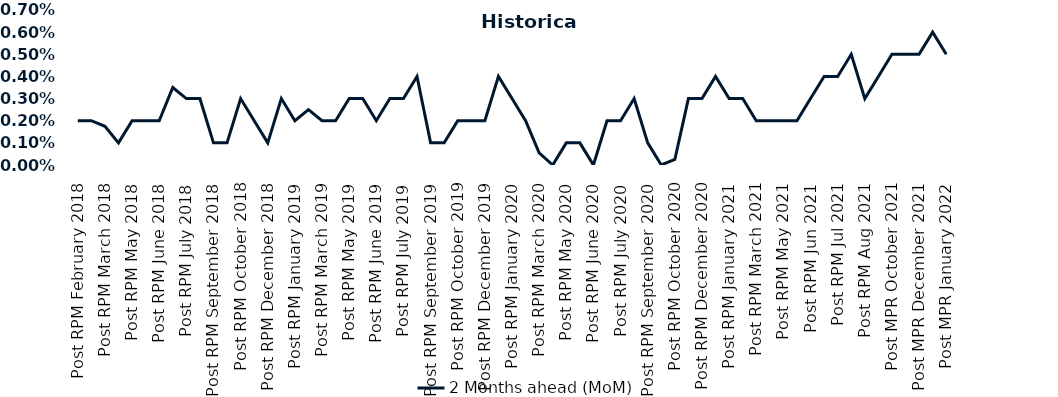
| Category | 2 Months ahead (MoM) |
|---|---|
| Post RPM February 2018 | 0.002 |
| Pre RPM March 2018 | 0.002 |
| Post RPM March 2018 | 0.002 |
| Pre RPM May 2018 | 0.001 |
| Post RPM May 2018 | 0.002 |
| Pre RPM June 2018 | 0.002 |
| Post RPM June 2018 | 0.002 |
| Pre RPM July 2018 | 0.004 |
| Post RPM July 2018 | 0.003 |
| Pre RPM September 2018 | 0.003 |
| Post RPM September 2018 | 0.001 |
| Pre RPM October 2018 | 0.001 |
| Post RPM October 2018 | 0.003 |
| Pre RPM December 2018 | 0.002 |
| Post RPM December 2018 | 0.001 |
| Pre RPM January 2019 | 0.003 |
| Post RPM January 2019 | 0.002 |
| Pre RPM March 2019 | 0.002 |
| Post RPM March 2019 | 0.002 |
| Pre RPM May 2019 | 0.002 |
| Post RPM May 2019 | 0.003 |
| Pre RPM June 2019 | 0.003 |
| Post RPM June 2019 | 0.002 |
| Pre RPM July 2019 | 0.003 |
| Post RPM July 2019 | 0.003 |
| Pre RPM September 2019 | 0.004 |
| Post RPM September 2019 | 0.001 |
| Pre RPM October 2019 | 0.001 |
| Post RPM October 2019 | 0.002 |
| Pre RPM December 2019 | 0.002 |
| Post RPM December 2019 | 0.002 |
| Pre RPM January 2020 | 0.004 |
| Post RPM January 2020 | 0.003 |
| Pre RPM March 2020 | 0.002 |
| Post RPM March 2020 | 0.001 |
| Pre RPM May 2020 | 0 |
| Post RPM May 2020 | 0.001 |
| Pre RPM June 2020 | 0.001 |
| Post RPM June 2020 | 0 |
| Pre RPM July 2020 | 0.002 |
| Post RPM July 2020 | 0.002 |
| Pre RPM September 2020 | 0.003 |
| Post RPM September 2020 | 0.001 |
| Pre RPM October 2020 | 0 |
| Post RPM October 2020 | 0 |
| Pre RPM December 2020 | 0.003 |
|  Post RPM December 2020 | 0.003 |
| Pre RPM January 2021 | 0.004 |
| Post RPM January 2021 | 0.003 |
|  Pre RPM March 2021 | 0.003 |
|  Post RPM March 2021 | 0.002 |
|  Pre RPM May 2021 | 0.002 |
|  Post RPM May 2021 | 0.002 |
|  Pre RPM Jun 2021 | 0.002 |
|   Post RPM Jun 2021 | 0.003 |
| Pre RPM Jul 2021 | 0.004 |
|  Post RPM Jul 2021 | 0.004 |
| Pre RPM Aug 2021 | 0.005 |
|  Post RPM Aug 2021 | 0.003 |
| Pre MPR October 2021 | 0.004 |
| Post MPR October 2021 | 0.005 |
| Pre MPR December 2021 | 0.005 |
| Post MPR December 2021 | 0.005 |
| Pre MPR January 2022 | 0.006 |
| Post MPR January 2022 | 0.005 |